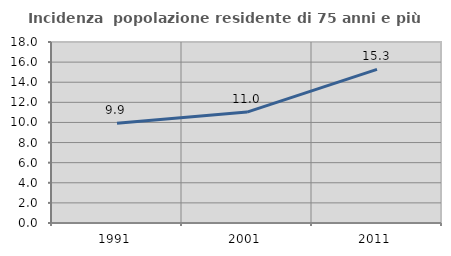
| Category | Incidenza  popolazione residente di 75 anni e più |
|---|---|
| 1991.0 | 9.911 |
| 2001.0 | 11.029 |
| 2011.0 | 15.274 |